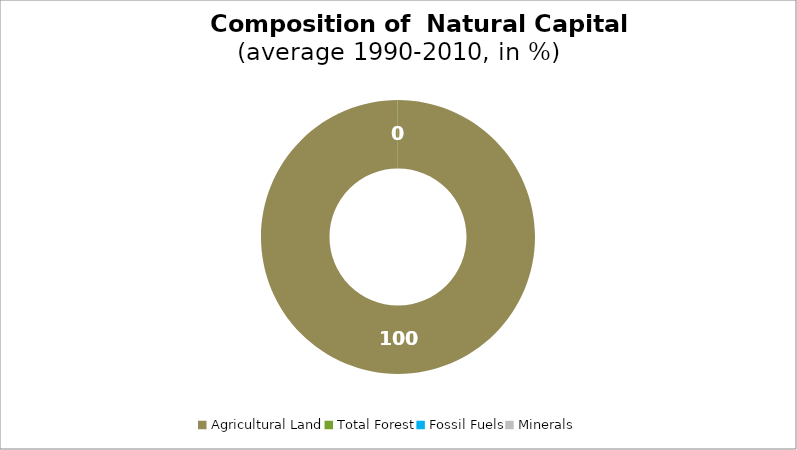
| Category | Series 0 |
|---|---|
| Agricultural Land | 99.968 |
| Total Forest | 0.032 |
| Fossil Fuels | 0 |
| Minerals | 0 |